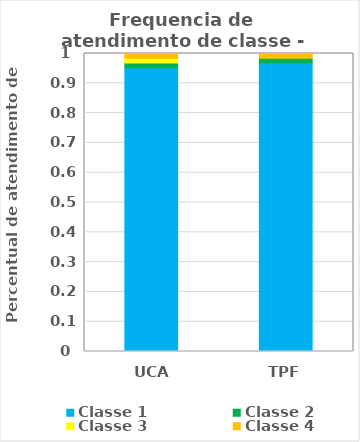
| Category | Classe 1 | Classe 2 | Classe 3 | Classe 4 |
|---|---|---|---|---|
| UCA | 0.952 | 0.016 | 0.016 | 0.016 |
| TPF | 0.968 | 0.016 | 0 | 0.016 |